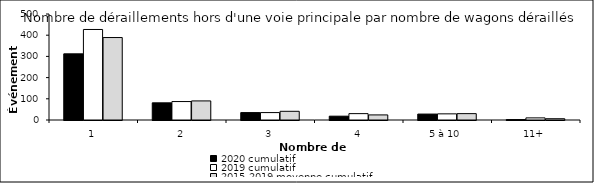
| Category | 2020 cumulatif | 2019 cumulatif | 2015-2019 moyenne cumulatif |
|---|---|---|---|
| 1 | 312 | 427 | 389 |
| 2 | 81 | 87 | 90 |
| 3 | 35 | 35 | 41 |
| 4 | 18 | 30 | 24 |
| 5 à 10 | 28 | 29 | 30 |
| 11+ | 2 | 10 | 6 |